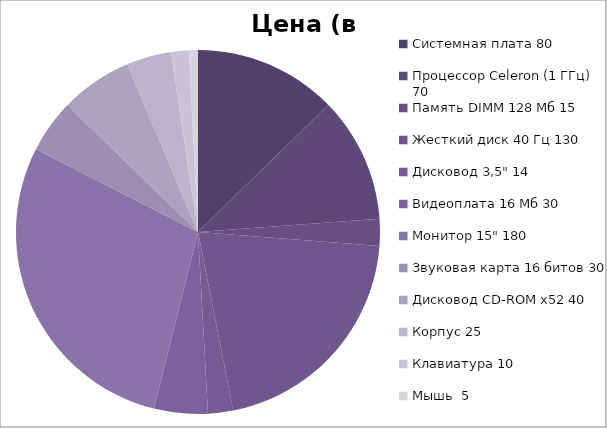
| Category | Цена (в у.е.) |
|---|---|
| 0 | 80 |
| 1 | 70 |
| 2 | 15 |
| 3 | 130 |
| 4 | 14 |
| 5 | 30 |
| 6 | 180 |
| 7 | 30 |
| 8 | 40 |
| 9 | 25 |
| 10 | 10 |
| 11 | 5 |